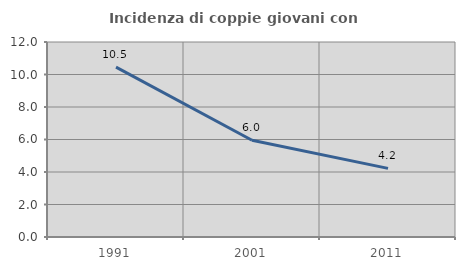
| Category | Incidenza di coppie giovani con figli |
|---|---|
| 1991.0 | 10.454 |
| 2001.0 | 5.956 |
| 2011.0 | 4.224 |